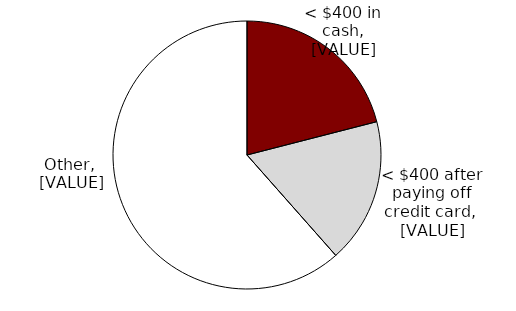
| Category | Series 0 |
|---|---|
| < $400 in cash | 0.21 |
|  < $400 after paying off credit card | 0.175 |
| Other | 0.615 |